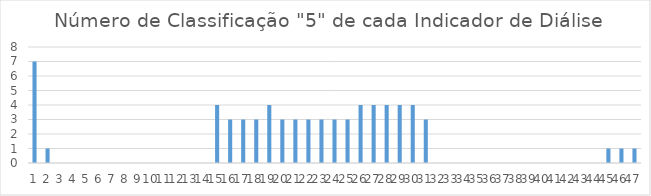
| Category | Series 0 |
|---|---|
| 0 | 7 |
| 1 | 1 |
| 2 | 0 |
| 3 | 0 |
| 4 | 0 |
| 5 | 0 |
| 6 | 0 |
| 7 | 0 |
| 8 | 0 |
| 9 | 0 |
| 10 | 0 |
| 11 | 0 |
| 12 | 0 |
| 13 | 0 |
| 14 | 4 |
| 15 | 3 |
| 16 | 3 |
| 17 | 3 |
| 18 | 4 |
| 19 | 3 |
| 20 | 3 |
| 21 | 3 |
| 22 | 3 |
| 23 | 3 |
| 24 | 3 |
| 25 | 4 |
| 26 | 4 |
| 27 | 4 |
| 28 | 4 |
| 29 | 4 |
| 30 | 3 |
| 31 | 0 |
| 32 | 0 |
| 33 | 0 |
| 34 | 0 |
| 35 | 0 |
| 36 | 0 |
| 37 | 0 |
| 38 | 0 |
| 39 | 0 |
| 40 | 0 |
| 41 | 0 |
| 42 | 0 |
| 43 | 0 |
| 44 | 1 |
| 45 | 1 |
| 46 | 1 |